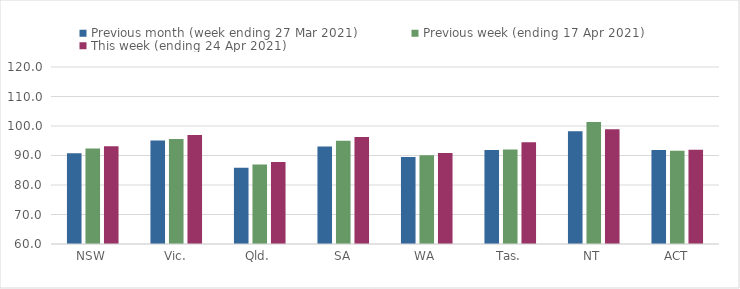
| Category | Previous month (week ending 27 Mar 2021) | Previous week (ending 17 Apr 2021) | This week (ending 24 Apr 2021) |
|---|---|---|---|
| NSW | 90.79 | 92.35 | 93.15 |
| Vic. | 95.08 | 95.6 | 96.94 |
| Qld. | 85.87 | 86.92 | 87.83 |
| SA | 93.01 | 95.01 | 96.23 |
| WA | 89.45 | 90.12 | 90.84 |
| Tas. | 91.89 | 92.01 | 94.5 |
| NT | 98.25 | 101.32 | 98.87 |
| ACT | 91.89 | 91.57 | 91.95 |